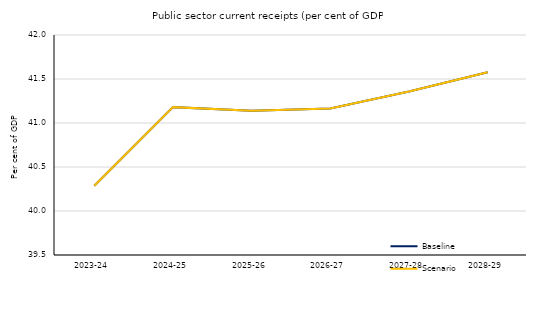
| Category | Baseline | Scenario |
|---|---|---|
| 2023-24 | 40.287 | 40.287 |
| 2024-25 | 41.18 | 41.18 |
| 2025-26 | 41.139 | 41.139 |
| 2026-27 | 41.165 | 41.165 |
| 2027-28 | 41.358 | 41.358 |
| 2028-29 | 41.578 | 41.578 |